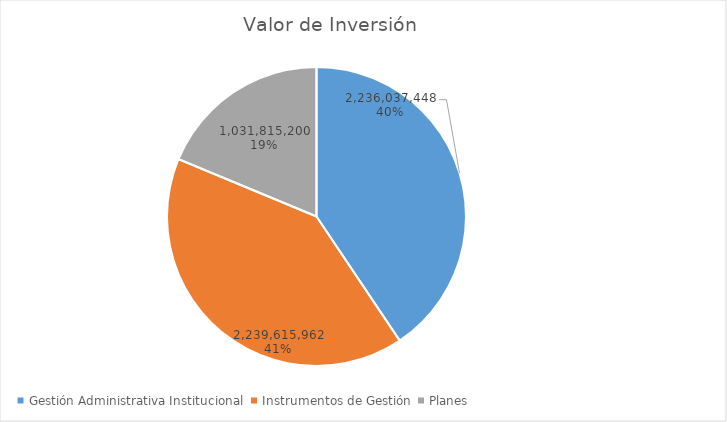
| Category | Valor de Inversión | Porcentaje de Ejecución dentro de la Actividad |
|---|---|---|
| Gestión Administrativa Institucional | 2236037448 | 6 |
| Instrumentos de Gestión | 2239615962 | 8 |
| Planes | 1031815200 | 8 |